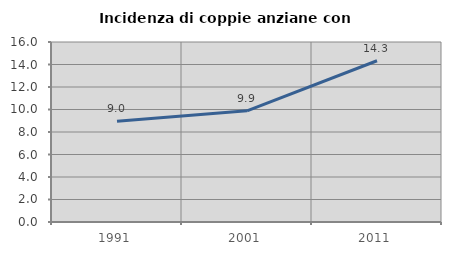
| Category | Incidenza di coppie anziane con figli |
|---|---|
| 1991.0 | 8.955 |
| 2001.0 | 9.88 |
| 2011.0 | 14.332 |